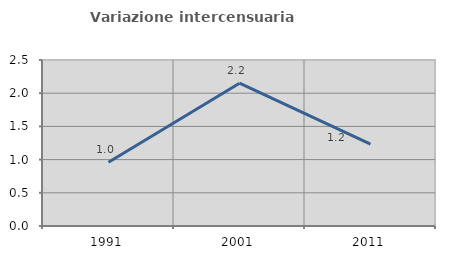
| Category | Variazione intercensuaria annua |
|---|---|
| 1991.0 | 0.96 |
| 2001.0 | 2.151 |
| 2011.0 | 1.232 |